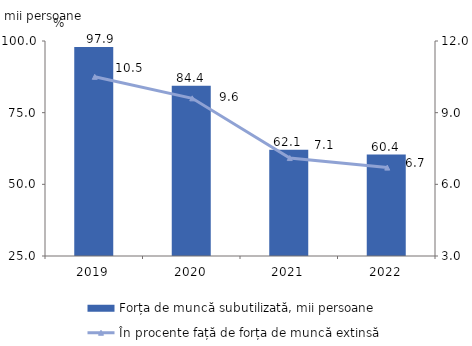
| Category | Forța de muncă subutilizată, mii persoane |
|---|---|
| 2019.0 | 97.9 |
| 2020.0 | 84.4 |
| 2021.0 | 62.1 |
| 2022.0 | 60.4 |